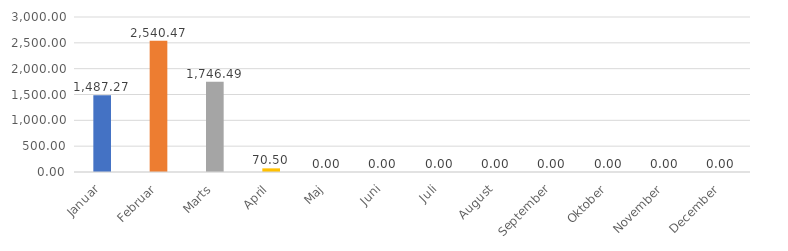
| Category | Series 0 |
|---|---|
| Januar | 1487.27 |
| Februar | 2540.47 |
| Marts | 1746.49 |
| April | 70.5 |
| Maj | 0 |
| Juni | 0 |
| Juli | 0 |
| August | 0 |
| September | 0 |
| Oktober | 0 |
| November | 0 |
| December | 0 |